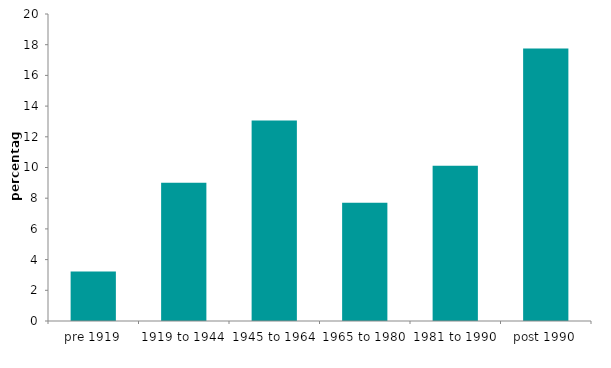
| Category | Series 0 |
|---|---|
| pre 1919 | 3.226 |
| 1919 to 1944 | 9.001 |
| 1945 to 1964 | 13.062 |
| 1965 to 1980 | 7.699 |
| 1981 to 1990 | 10.111 |
| post 1990 | 17.756 |